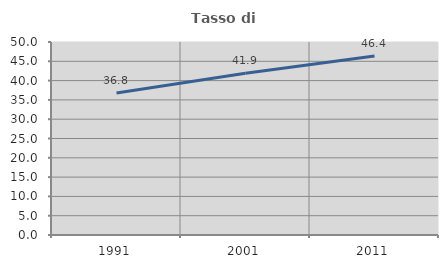
| Category | Tasso di occupazione   |
|---|---|
| 1991.0 | 36.777 |
| 2001.0 | 41.882 |
| 2011.0 | 46.373 |